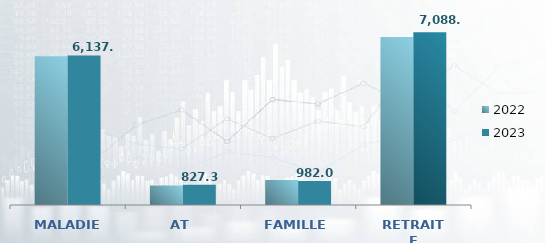
| Category | 2022 | 2023 |
|---|---|---|
| MALADIE | 6106.601 | 6137.247 |
| AT | 800.574 | 827.333 |
| FAMILLE | 1023.514 | 981.955 |
| RETRAITE | 6893.747 | 7088.417 |